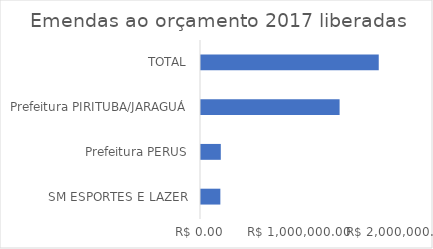
| Category | Series 0 |
|---|---|
| SM ESPORTES E LAZER | 195454 |
| Prefeitura PERUS | 200000 |
| Prefeitura PIRITUBA/JARAGUÁ | 1400000 |
| TOTAL | 1795454 |